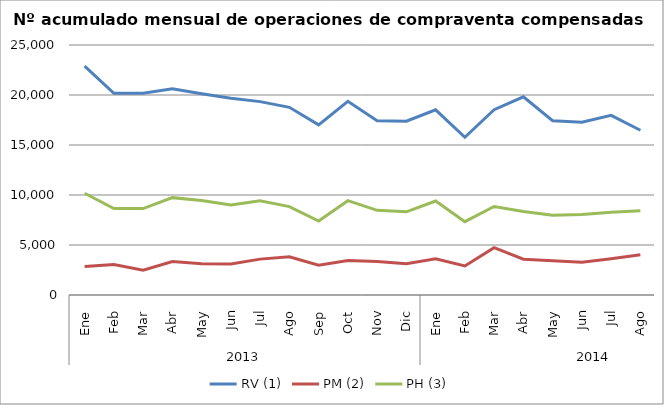
| Category | RV (1) | PM (2) | PH (3) |
|---|---|---|---|
| 0 | 22894 | 2853 | 10176 |
| 1 | 20174 | 3047 | 8641 |
| 2 | 20169 | 2472 | 8638 |
| 3 | 20616 | 3350 | 9736 |
| 4 | 20126 | 3117 | 9441 |
| 5 | 19686 | 3099 | 9000 |
| 6 | 19337 | 3588 | 9415 |
| 7 | 18769 | 3829 | 8838 |
| 8 | 17015 | 2969 | 7402 |
| 9 | 19371 | 3453 | 9435 |
| 10 | 17427 | 3359 | 8465 |
| 11 | 17377 | 3135 | 8315 |
| 12 | 18515 | 3629 | 9396 |
| 13 | 15776 | 2899 | 7337 |
| 14 | 18527 | 4739 | 8846 |
| 15 | 19824 | 3575 | 8345 |
| 16 | 17431 | 3429 | 7965 |
| 17 | 17272 | 3273 | 8041 |
| 18 | 17970 | 3623 | 8279 |
| 19 | 16473 | 4014 | 8423 |